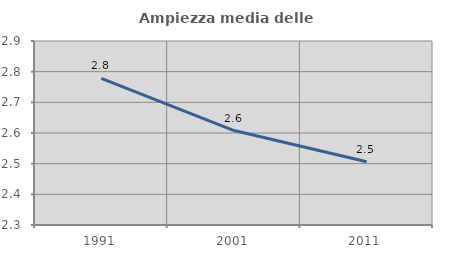
| Category | Ampiezza media delle famiglie |
|---|---|
| 1991.0 | 2.778 |
| 2001.0 | 2.608 |
| 2011.0 | 2.506 |